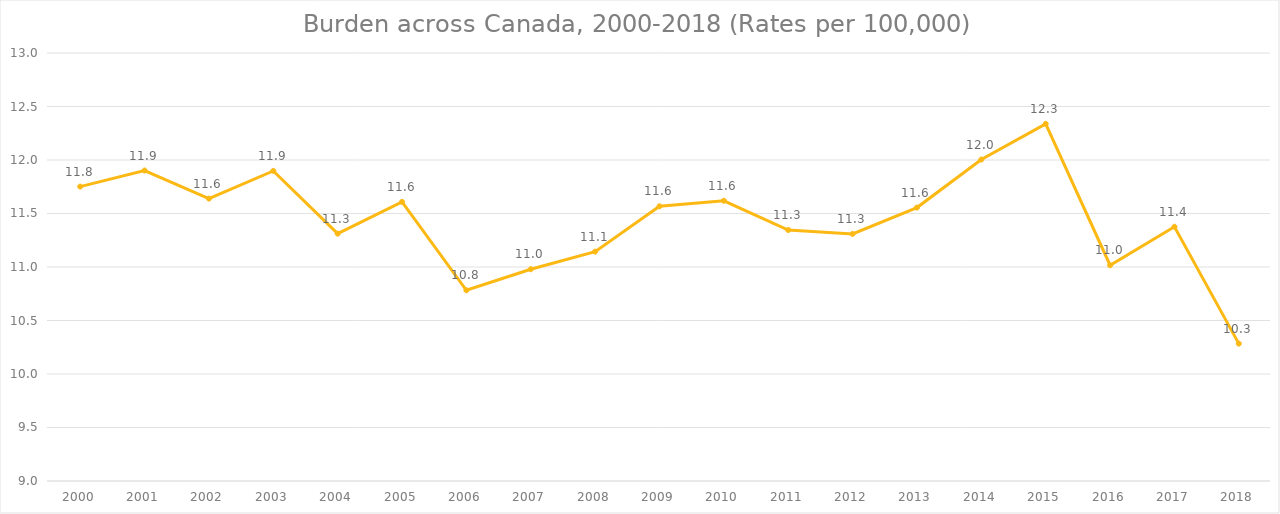
| Category | Series 0 |
|---|---|
| 2000.0 | 11.751 |
| 2001.0 | 11.902 |
| 2002.0 | 11.639 |
| 2003.0 | 11.898 |
| 2004.0 | 11.312 |
| 2005.0 | 11.608 |
| 2006.0 | 10.783 |
| 2007.0 | 10.979 |
| 2008.0 | 11.144 |
| 2009.0 | 11.567 |
| 2010.0 | 11.619 |
| 2011.0 | 11.346 |
| 2012.0 | 11.309 |
| 2013.0 | 11.555 |
| 2014.0 | 12.004 |
| 2015.0 | 12.338 |
| 2016.0 | 11.016 |
| 2017.0 | 11.376 |
| 2018.0 | 10.284 |